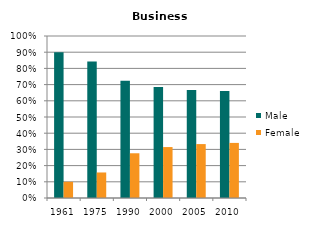
| Category | Male | Female |
|---|---|---|
| 1961.0 | 0.9 | 0.1 |
| 1975.0 | 0.842 | 0.158 |
| 1990.0 | 0.724 | 0.276 |
| 2000.0 | 0.686 | 0.314 |
| 2005.0 | 0.667 | 0.333 |
| 2010.0 | 0.66 | 0.34 |